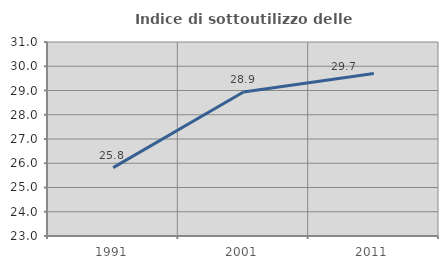
| Category | Indice di sottoutilizzo delle abitazioni  |
|---|---|
| 1991.0 | 25.82 |
| 2001.0 | 28.938 |
| 2011.0 | 29.703 |